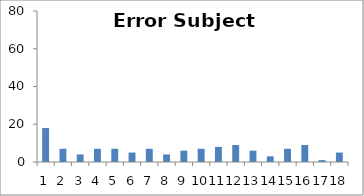
| Category | Sub14 |
|---|---|
| 0 | 18 |
| 1 | 7 |
| 2 | 4 |
| 3 | 7 |
| 4 | 7 |
| 5 | 5 |
| 6 | 7 |
| 7 | 4 |
| 8 | 6 |
| 9 | 7 |
| 10 | 8 |
| 11 | 9 |
| 12 | 6 |
| 13 | 3 |
| 14 | 7 |
| 15 | 9 |
| 16 | 1 |
| 17 | 5 |